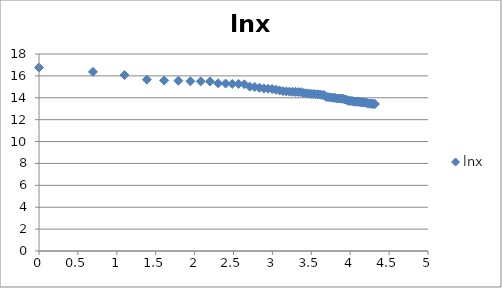
| Category | lnx |
|---|---|
| 0.0 | 16.76 |
| 0.6931471805599453 | 16.371 |
| 1.0986122886681098 | 16.074 |
| 1.3862943611198906 | 15.656 |
| 1.6094379124341003 | 15.58 |
| 1.791759469228055 | 15.561 |
| 1.9459101490553132 | 15.505 |
| 2.0794415416798357 | 15.498 |
| 2.1972245773362196 | 15.494 |
| 2.302585092994046 | 15.325 |
| 2.3978952727983707 | 15.303 |
| 2.4849066497880004 | 15.27 |
| 2.5649493574615367 | 15.268 |
| 2.6390573296152584 | 15.23 |
| 2.70805020110221 | 15.023 |
| 2.772588722239781 | 14.988 |
| 2.833213344056216 | 14.914 |
| 2.8903717578961645 | 14.851 |
| 2.9444389791664403 | 14.821 |
| 2.995732273553991 | 14.797 |
| 3.044522437723423 | 14.734 |
| 3.091042453358316 | 14.67 |
| 3.1354942159291497 | 14.607 |
| 3.1780538303479458 | 14.583 |
| 3.2188758248682006 | 14.562 |
| 3.258096538021482 | 14.552 |
| 3.295836866004329 | 14.536 |
| 3.332204510175204 | 14.524 |
| 3.367295829986474 | 14.51 |
| 3.4011973816621555 | 14.439 |
| 3.4339872044851463 | 14.414 |
| 3.4657359027997265 | 14.388 |
| 3.4965075614664802 | 14.355 |
| 3.5263605246161616 | 14.347 |
| 3.5553480614894135 | 14.321 |
| 3.58351893845611 | 14.318 |
| 3.6109179126442243 | 14.286 |
| 3.6375861597263857 | 14.254 |
| 3.6635616461296463 | 14.253 |
| 3.6888794541139363 | 14.088 |
| 3.713572066704308 | 14.067 |
| 3.7376696182833684 | 14.034 |
| 3.7612001156935624 | 14.019 |
| 3.784189633918261 | 14.003 |
| 3.8066624897703196 | 13.99 |
| 3.828641396489095 | 13.941 |
| 3.8501476017100584 | 13.933 |
| 3.871201010907891 | 13.927 |
| 3.8918202981106265 | 13.925 |
| 3.912023005428146 | 13.901 |
| 3.9318256327243257 | 13.849 |
| 3.9512437185814275 | 13.827 |
| 3.970291913552122 | 13.728 |
| 3.9889840465642745 | 13.72 |
| 4.007333185232471 | 13.716 |
| 4.02535169073515 | 13.705 |
| 4.04305126783455 | 13.658 |
| 4.060443010546419 | 13.648 |
| 4.07753744390572 | 13.648 |
| 4.0943445622221 | 13.639 |
| 4.110873864173311 | 13.637 |
| 4.127134385045092 | 13.603 |
| 4.143134726391533 | 13.593 |
| 4.1588830833596715 | 13.59 |
| 4.174387269895637 | 13.569 |
| 4.189654742026425 | 13.563 |
| 4.204692619390966 | 13.554 |
| 4.219507705176107 | 13.507 |
| 4.23410650459726 | 13.481 |
| 4.248495242049359 | 13.474 |
| 4.2626798770413155 | 13.458 |
| 4.276666119016055 | 13.457 |
| 4.290459441148391 | 13.44 |
| 4.30406509320417 | 13.434 |
| 4.31748811353631 | 13.432 |